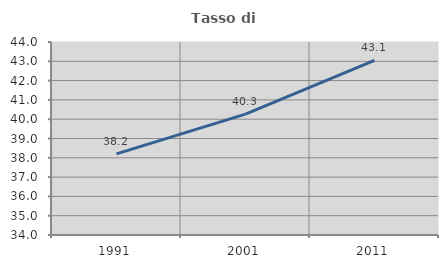
| Category | Tasso di occupazione   |
|---|---|
| 1991.0 | 38.204 |
| 2001.0 | 40.263 |
| 2011.0 | 43.054 |